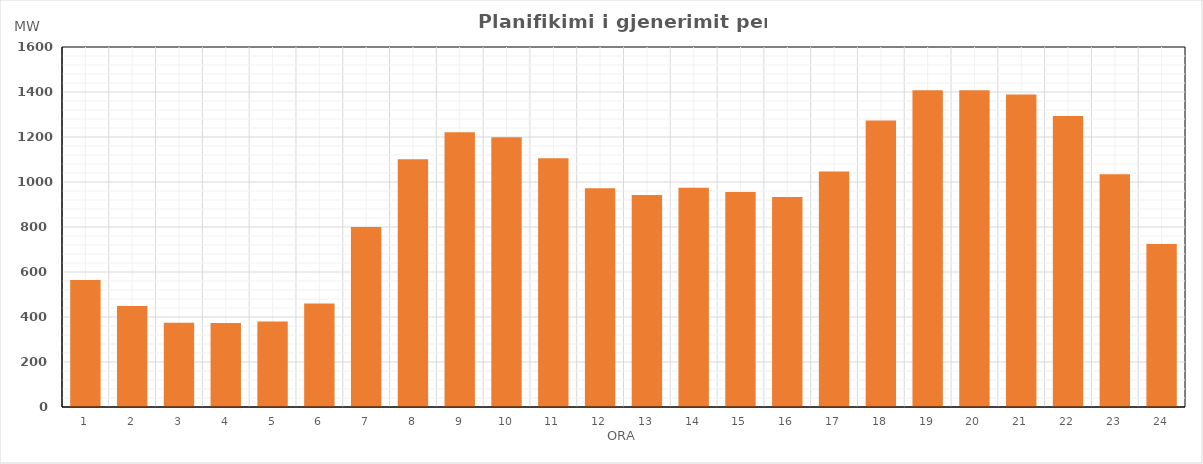
| Category | Max (MW) |
|---|---|
| 0 | 564.631 |
| 1 | 449.188 |
| 2 | 374.267 |
| 3 | 372.866 |
| 4 | 380.193 |
| 5 | 460.492 |
| 6 | 799.678 |
| 7 | 1100.646 |
| 8 | 1220.88 |
| 9 | 1198.439 |
| 10 | 1105.702 |
| 11 | 972.136 |
| 12 | 942.141 |
| 13 | 974.083 |
| 14 | 955.545 |
| 15 | 933.749 |
| 16 | 1046.406 |
| 17 | 1273.035 |
| 18 | 1407.492 |
| 19 | 1407.96 |
| 20 | 1388.802 |
| 21 | 1292.853 |
| 22 | 1034.23 |
| 23 | 723.992 |